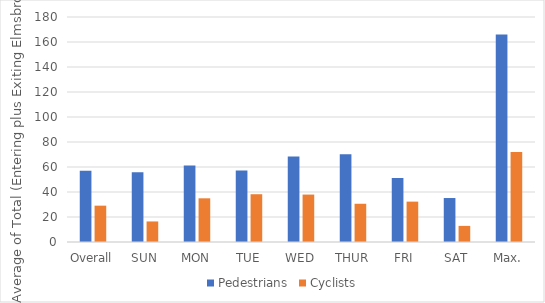
| Category | Pedestrians | Cyclists |
|---|---|---|
| Overall | 57.041 | 29.066 |
| SUN | 55.778 | 16.444 |
| MON | 61.111 | 34.944 |
| TUE | 57.278 | 38.222 |
| WED | 68.353 | 37.941 |
| THUR | 70.118 | 30.588 |
| FRI | 51.294 | 32.294 |
| SAT | 35.176 | 12.882 |
| Max. | 166 | 72 |